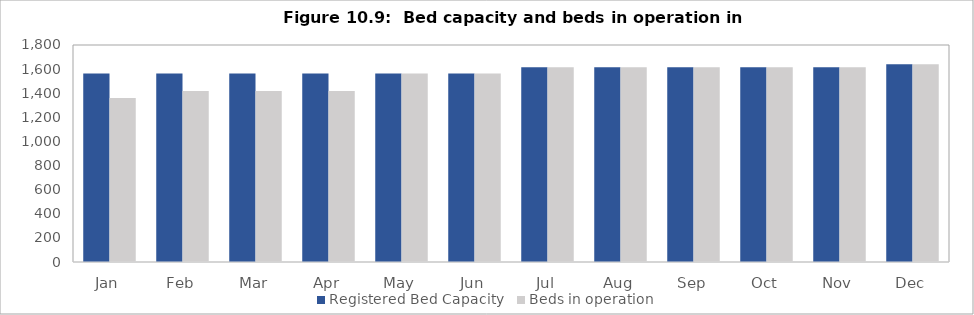
| Category | Registered Bed Capacity  | Beds in operation  |
|---|---|---|
| Jan | 1564 | 1360 |
| Feb | 1564 | 1418 |
| Mar | 1564 | 1418 |
| Apr | 1564 | 1418 |
| May | 1564 | 1564 |
| Jun | 1564 | 1564 |
| Jul | 1616 | 1616 |
| Aug | 1616 | 1616 |
| Sep | 1616 | 1616 |
| Oct | 1616 | 1616 |
| Nov | 1616 | 1616 |
| Dec | 1640 | 1640 |